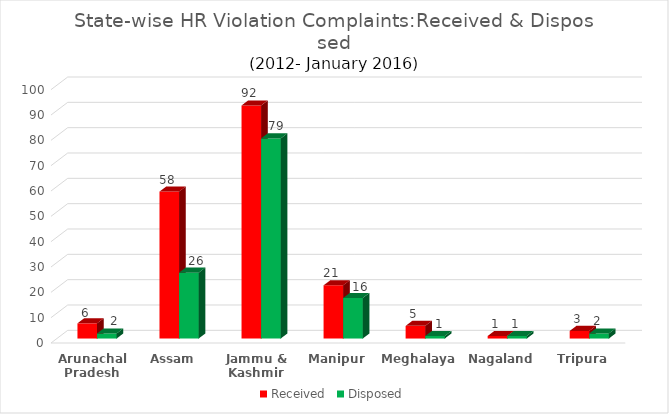
| Category | Received | Disposed |
|---|---|---|
| Arunachal Pradesh | 6 | 2 |
| Assam | 58 | 26 |
| Jammu & Kashmir | 92 | 79 |
| Manipur | 21 | 16 |
| Meghalaya | 5 | 1 |
| Nagaland | 1 | 1 |
| Tripura | 3 | 2 |